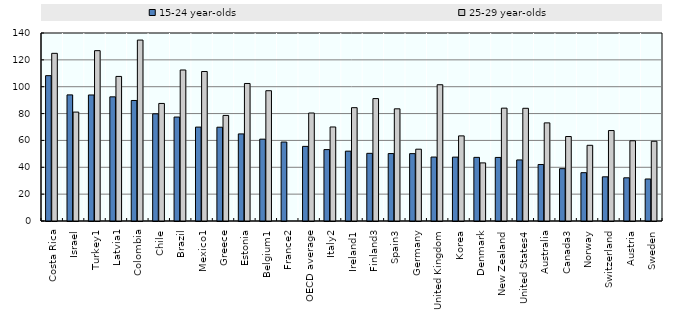
| Category | 15-24 year-olds | 25-29 year-olds |
|---|---|---|
| Costa Rica | 108.242 | 124.856 |
| Israel | 93.914 | 81.104 |
| Turkey1 | 93.846 | 126.847 |
| Latvia1 | 92.459 | 107.661 |
| Colombia | 89.751 | 134.734 |
| Chile | 79.814 | 87.542 |
| Brazil | 77.409 | 112.458 |
| Mexico1 | 69.93 | 111.34 |
| Greece | 69.847 | 78.621 |
| Estonia | 64.855 | 102.414 |
| Belgium1 | 60.939 | 97.02 |
| France2 | 58.8 | 0 |
| OECD average | 55.564 | 80.419 |
| Italy2 | 53.183 | 70.018 |
| Ireland1 | 52.007 | 84.39 |
| Finland3 | 50.388 | 91.16 |
| Spain3 | 50.221 | 83.539 |
| Germany | 50.169 | 53.47 |
| United Kingdom | 47.614 | 101.474 |
| Korea | 47.559 | 63.389 |
| Denmark | 47.381 | 43.267 |
| New Zealand | 47.339 | 84.033 |
| United States4 | 45.466 | 83.934 |
| Australia | 42.082 | 73.065 |
| Canada3 | 38.96 | 62.913 |
| Norway | 35.984 | 56.371 |
| Switzerland | 32.905 | 67.364 |
| Austria | 32.164 | 59.739 |
| Sweden | 31.285 | 59.387 |